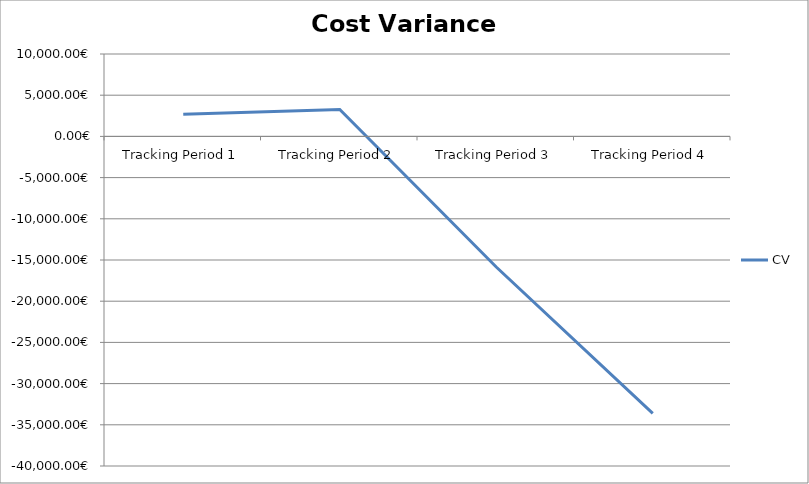
| Category | CV |
|---|---|
| Tracking Period 1 | 2702 |
| Tracking Period 2 | 3264 |
| Tracking Period 3 | -15853 |
| Tracking Period 4 | -33625 |